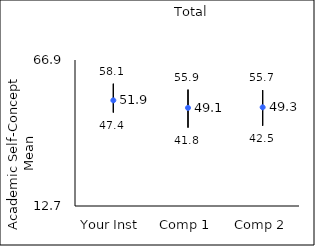
| Category | 25th percentile | 75th percentile | Mean |
|---|---|---|---|
| Your Inst | 47.4 | 58.1 | 51.92 |
| Comp 1 | 41.8 | 55.9 | 49.13 |
| Comp 2 | 42.5 | 55.7 | 49.34 |